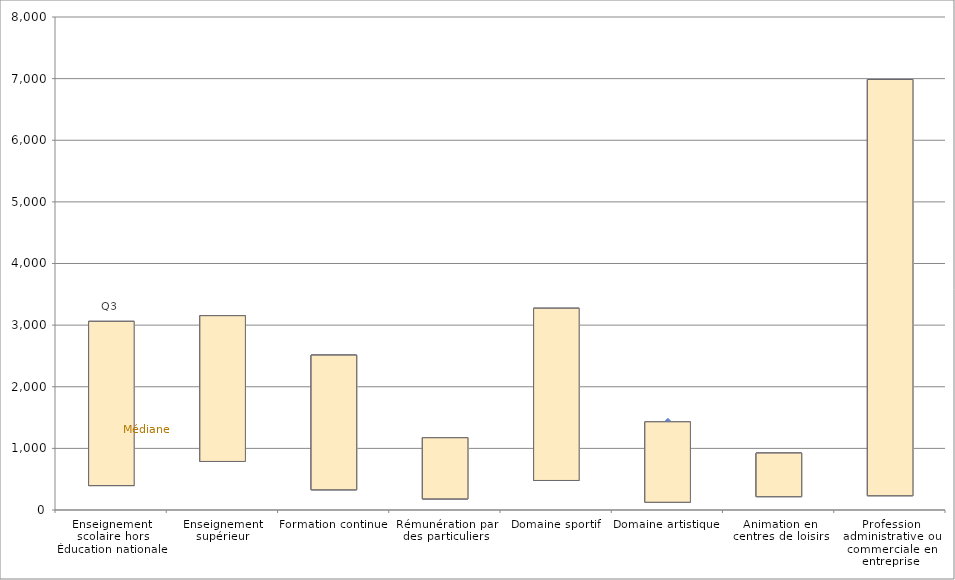
| Category | Q1 | Médiane | Moyenne | Q3 |
|---|---|---|---|---|
| Enseignement scolaire hors Éducation nationale | 396.5 | 1228 | 2317.557 | 3061 |
| Enseignement supérieur | 788 | 1669 | 2535.087 | 3153 |
| Formation continue | 328.5 | 989 | 2126.875 | 2513 |
| Rémunération par des particuliers | 181 | 498 | 1117.145 | 1172 |
| Domaine sportif | 479.31 | 1163 | 2342.25 | 3273.462 |
| Domaine artistique | 126.402 | 399.921 | 1422.69 | 1430.626 |
| Animation en centres de loisirs | 216.923 | 431 | 841.494 | 923.348 |
| Profession administrative ou commerciale en entreprise | 232.381 | 844.279 | 4006.231 | 6985.991 |